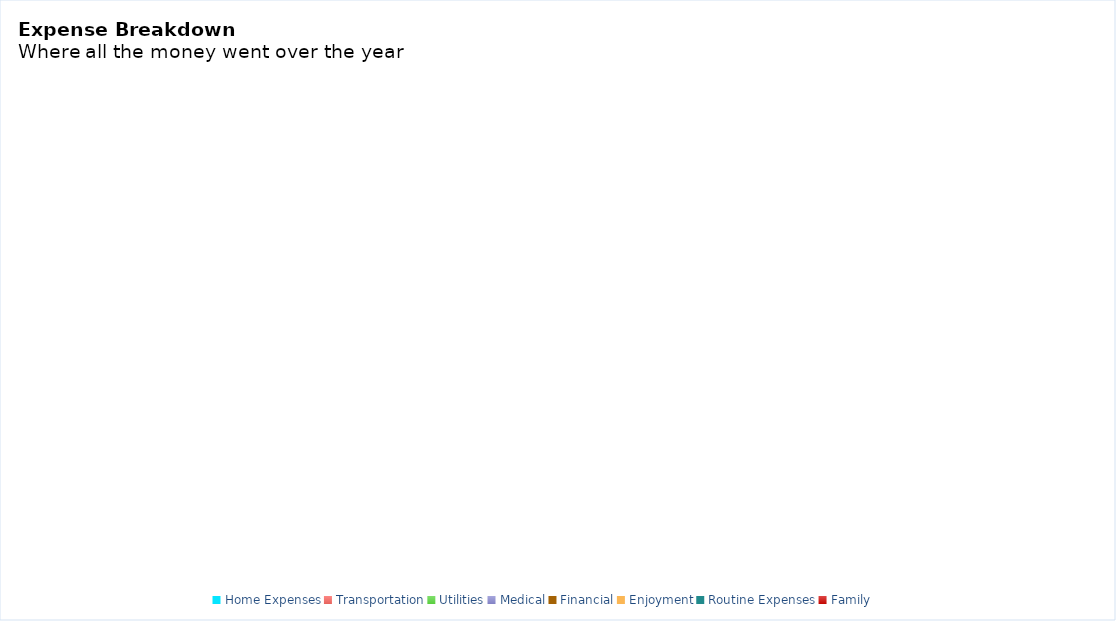
| Category | Total |
|---|---|
| Home Expenses | 0 |
| Transportation | 0 |
| Utilities | 0 |
| Medical | 0 |
| Financial | 0 |
| Enjoyment | 0 |
| Routine Expenses | 0 |
| Family | 0 |